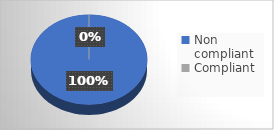
| Category | Series 0 |
|---|---|
| Non compliant | 17 |
| Compliant | 0 |